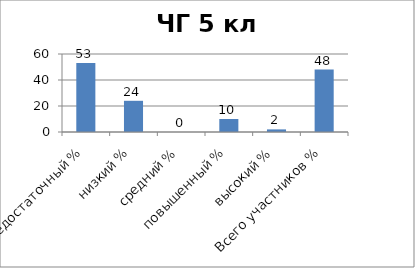
| Category | Series 0 |
|---|---|
| недостаточный % | 53 |
| низкий % | 24 |
| средний % | 0 |
| повышенный % | 10 |
| высокий % | 2 |
| Всего участников % | 48 |